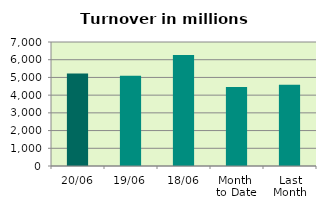
| Category | Series 0 |
|---|---|
| 20/06 | 5225.55 |
| 19/06 | 5090.262 |
| 18/06 | 6261.25 |
| Month 
to Date | 4453.732 |
| Last
Month | 4586.899 |